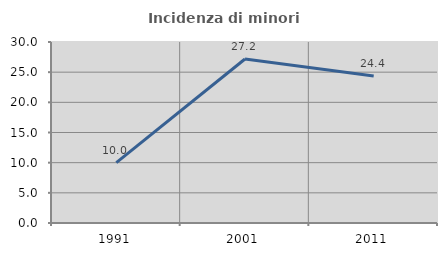
| Category | Incidenza di minori stranieri |
|---|---|
| 1991.0 | 10 |
| 2001.0 | 27.178 |
| 2011.0 | 24.377 |